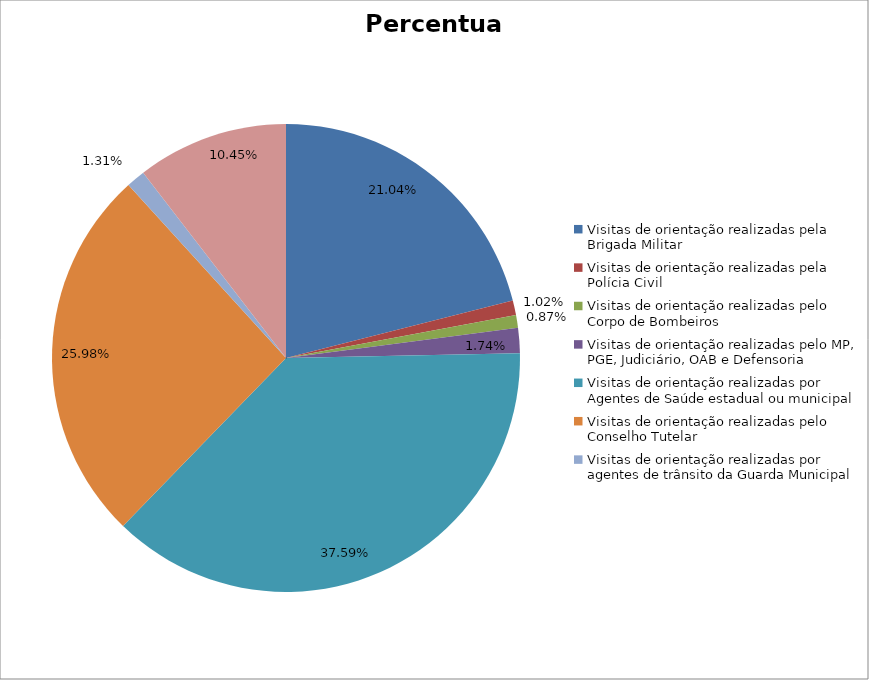
| Category | Percentual |
|---|---|
| Visitas de orientação realizadas pela Brigada Militar | 0.21 |
| Visitas de orientação realizadas pela Polícia Civil | 0.01 |
| Visitas de orientação realizadas pelo Corpo de Bombeiros | 0.009 |
| Visitas de orientação realizadas pelo MP, PGE, Judiciário, OAB e Defensoria | 0.017 |
| Visitas de orientação realizadas por Agentes de Saúde estadual ou municipal | 0.376 |
| Visitas de orientação realizadas pelo Conselho Tutelar | 0.26 |
| Visitas de orientação realizadas por agentes de trânsito da Guarda Municipal | 0.013 |
| Visitas de orientação realizadas por ONGs, entidades privadas, CRAS e CREAS | 0.104 |